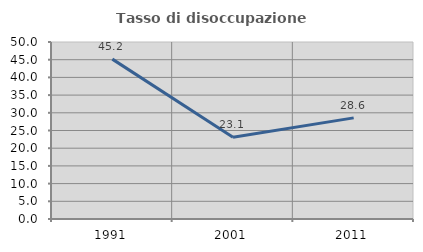
| Category | Tasso di disoccupazione giovanile  |
|---|---|
| 1991.0 | 45.161 |
| 2001.0 | 23.077 |
| 2011.0 | 28.571 |